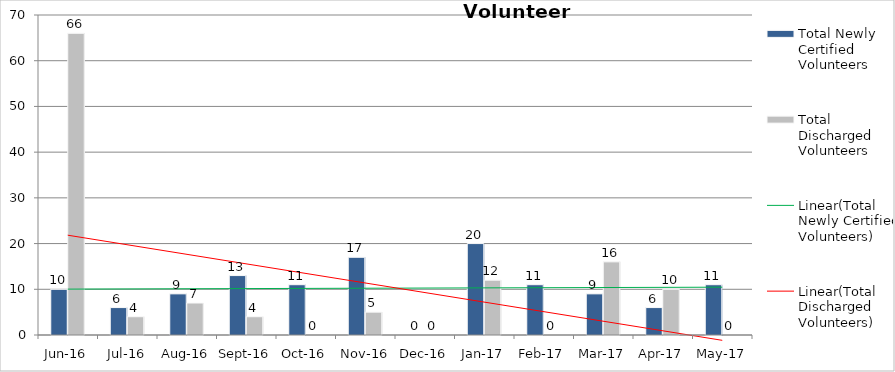
| Category | Total Newly Certified Volunteers | Total Discharged Volunteers |
|---|---|---|
| Jun-16 | 10 | 66 |
| Jul-16 | 6 | 4 |
| Aug-16 | 9 | 7 |
| Sep-16 | 13 | 4 |
| Oct-16 | 11 | 0 |
| Nov-16 | 17 | 5 |
| Dec-16 | 0 | 0 |
| Jan-17 | 20 | 12 |
| Feb-17 | 11 | 0 |
| Mar-17 | 9 | 16 |
| Apr-17 | 6 | 10 |
| May-17 | 11 | 0 |